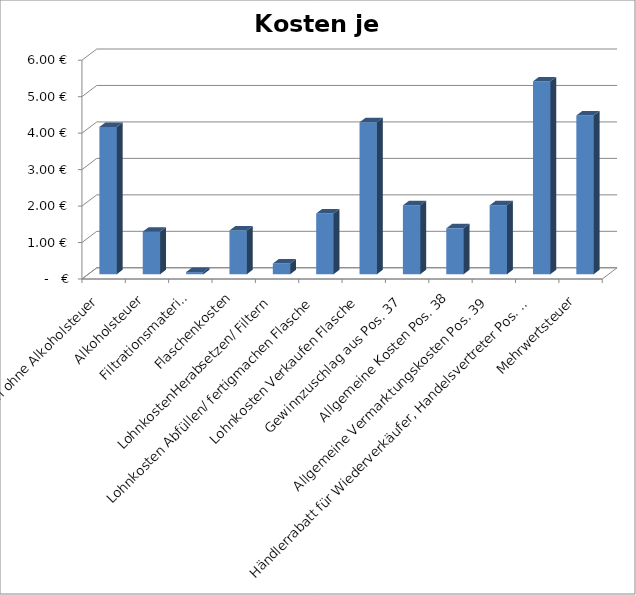
| Category | Kosten je Flasche |
|---|---|
| Destillat, Kosten ohne Alkoholsteuer | 4.039 |
| Alkoholsteuer | 1.168 |
| Filtrationsmaterial | 0.06 |
| Flaschenkosten | 1.2 |
| LohnkostenHerabsetzen/ Filtern | 0.294 |
| Lohnkosten Abfüllen/ fertigmachen Flasche | 1.667 |
| Lohnkosten Verkaufen Flasche | 4.167 |
| Gewinnzuschlag aus Pos. 37 | 1.889 |
| Allgemeine Kosten Pos. 38 | 1.259 |
| Allgemeine Vermarktungskosten Pos. 39 | 1.889 |
| Händlerrabatt für Wiederverkäufer, Handelsvertreter Pos. 40 | 5.29 |
| Mehrwertsteuer | 4.355 |